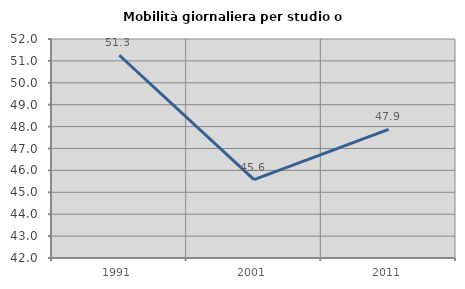
| Category | Mobilità giornaliera per studio o lavoro |
|---|---|
| 1991.0 | 51.259 |
| 2001.0 | 45.581 |
| 2011.0 | 47.874 |